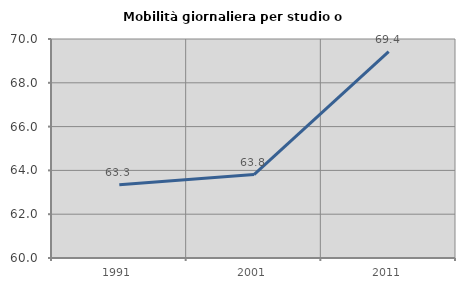
| Category | Mobilità giornaliera per studio o lavoro |
|---|---|
| 1991.0 | 63.34 |
| 2001.0 | 63.811 |
| 2011.0 | 69.422 |